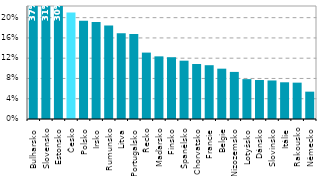
| Category | Series 0 |
|---|---|
| Bulharsko | 0.37 |
| Slovensko | 0.308 |
| Estonsko | 0.297 |
| Česko | 0.21 |
| Polsko | 0.194 |
| Irsko | 0.191 |
| Rumunsko | 0.185 |
| Litva | 0.169 |
| Portugalsko | 0.168 |
| Řecko | 0.131 |
| Maďarsko | 0.124 |
| Finsko | 0.122 |
| Španělsko | 0.115 |
| Chorvatsko | 0.109 |
| Francie | 0.106 |
| Belgie | 0.099 |
| Nizozemsko | 0.093 |
| Lotyšsko | 0.079 |
| Dánsko | 0.077 |
| Slovinsko | 0.076 |
| Itálie | 0.072 |
| Rakousko | 0.072 |
| Německo | 0.054 |